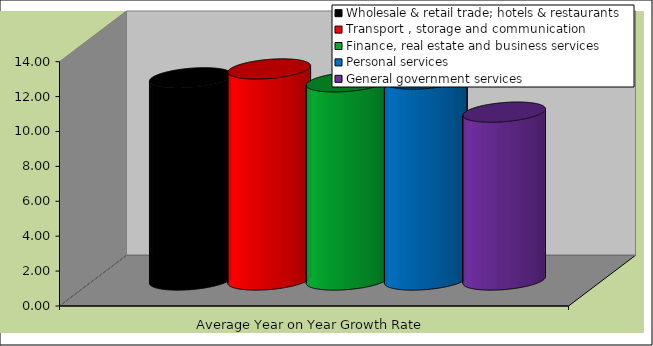
| Category | Wholesale & retail trade; hotels & restaurants | Transport , storage and communication | Finance, real estate and business services | Personal services | General government services |
|---|---|---|---|---|---|
| Average Year on Year Growth Rate | 11.585 | 12.093 | 11.352 | 11.512 | 9.619 |